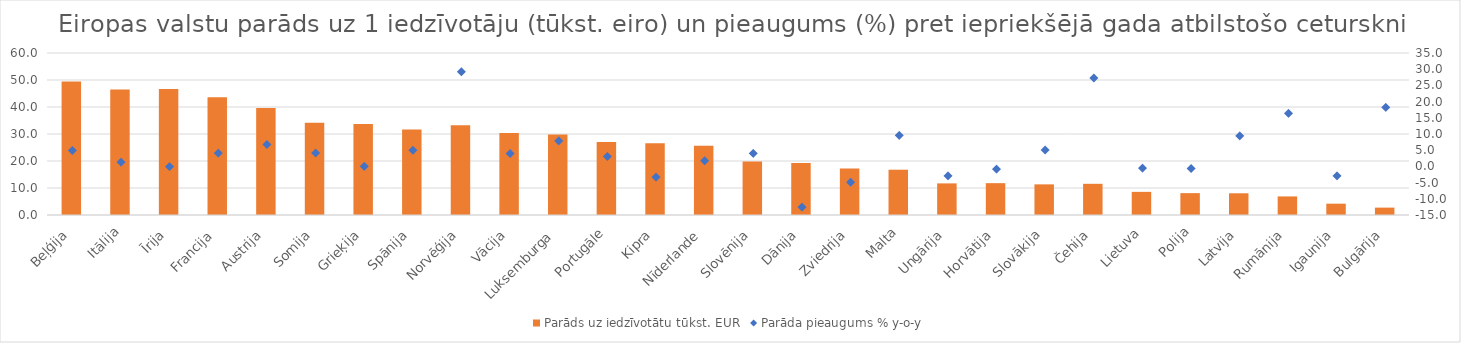
| Category | Parāds uz iedzīvotātu tūkst. EUR |
|---|---|
|  Beļģija | 49.437 |
| Itālija | 46.507 |
| Īrija | 46.668 |
| Francija | 43.583 |
| Austrija | 39.605 |
| Somija | 34.139 |
| Grieķija | 33.708 |
| Spānija | 31.704 |
| Norvēģija | 33.245 |
| Vācija | 30.363 |
| Luksemburga | 29.77 |
| Portugāle | 27.036 |
| Kipra | 26.531 |
| Nīderlande | 25.614 |
| Slovēnija | 19.814 |
| Dānija | 19.233 |
| Zviedrija | 17.182 |
| Malta | 16.772 |
| Ungārija | 11.706 |
| Horvātija | 11.795 |
| Slovākija | 11.349 |
| Čehija | 11.552 |
| Lietuva | 8.566 |
| Polija | 8.103 |
| Latvija | 8.042 |
| Rumānija | 6.875 |
| Igaunija | 4.194 |
| Bulgārija | 2.736 |